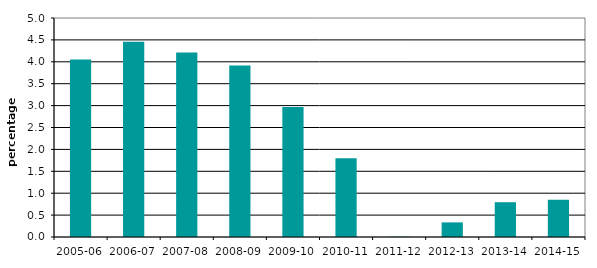
| Category | Series 0 |
|---|---|
| 2005-06 | 4.05 |
| 2006-07 | 4.457 |
| 2007-08 | 4.212 |
| 2008-09 | 3.917 |
| 2009-10 | 2.969 |
| 2010-11 | 1.795 |
| 2011-12 | 0.008 |
| 2012-13 | 0.333 |
| 2013-14 | 0.794 |
| 2014-15 | 0.851 |